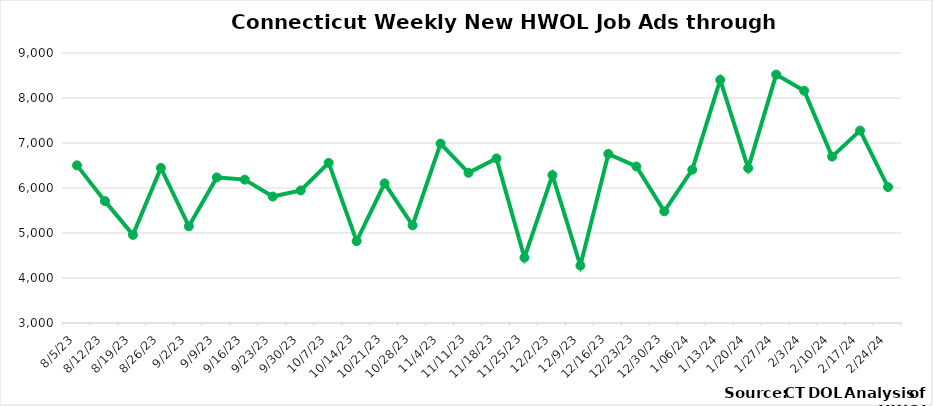
| Category | Connecticut |
|---|---|
| 8/5/23 | 6503 |
| 8/12/23 | 5708 |
| 8/19/23 | 4958 |
| 8/26/23 | 6447 |
| 9/2/23 | 5149 |
| 9/9/23 | 6235 |
| 9/16/23 | 6186 |
| 9/23/23 | 5810 |
| 9/30/23 | 5946 |
| 10/7/23 | 6558 |
| 10/14/23 | 4820 |
| 10/21/23 | 6103 |
| 10/28/23 | 5171 |
| 11/4/23 | 6987 |
| 11/11/23 | 6338 |
| 11/18/23 | 6658 |
| 11/25/23 | 4451 |
| 12/2/23 | 6286 |
| 12/9/23 | 4276 |
| 12/16/23 | 6757 |
|  12/23/23 | 6479 |
|  12/30/23 | 5482 |
|  1/06/24 | 6407 |
|  1/13/24 | 8403 |
|  1/20/24 | 6441 |
|  1/27/24 | 8521 |
|  2/3/24 | 8162 |
|  2/10/24 | 6698 |
|  2/17/24 | 7276 |
|  2/24/24 | 6021 |